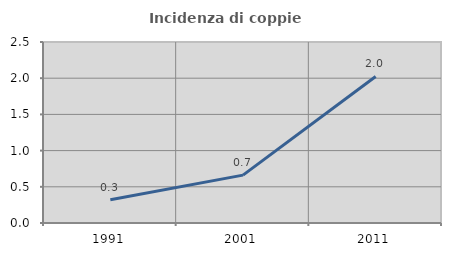
| Category | Incidenza di coppie miste |
|---|---|
| 1991.0 | 0.321 |
| 2001.0 | 0.661 |
| 2011.0 | 2.024 |